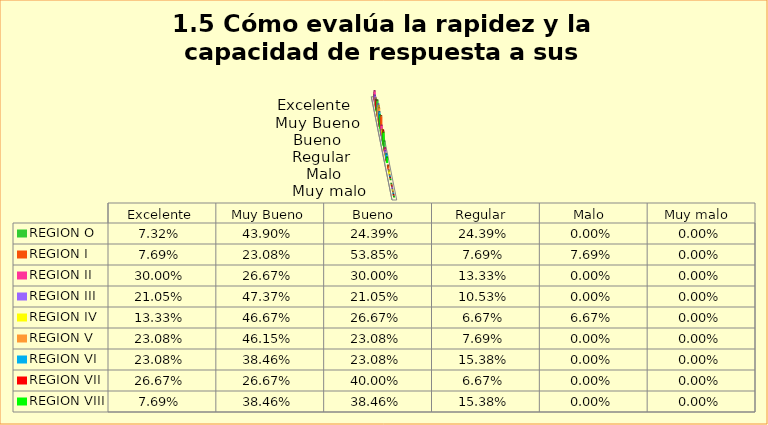
| Category | REGION O | REGION I  | REGION II | REGION III | REGION IV | REGION V  | REGION VI  | REGION VII  | REGION VIII |
|---|---|---|---|---|---|---|---|---|---|
| Excelente | 0.073 | 0.077 | 0.3 | 0.211 | 0.133 | 0.231 | 0.231 | 0.267 | 0.077 |
| Muy Bueno | 0.439 | 0.231 | 0.267 | 0.474 | 0.467 | 0.462 | 0.385 | 0.267 | 0.385 |
| Bueno  | 0.244 | 0.538 | 0.3 | 0.211 | 0.267 | 0.231 | 0.231 | 0.4 | 0.385 |
| Regular  | 0.244 | 0.077 | 0.133 | 0.105 | 0.067 | 0.077 | 0.154 | 0.067 | 0.154 |
| Malo  | 0 | 0.077 | 0 | 0 | 0.067 | 0 | 0 | 0 | 0 |
| Muy malo  | 0 | 0 | 0 | 0 | 0 | 0 | 0 | 0 | 0 |